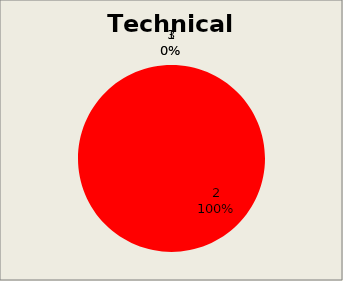
| Category | Series 3 |
|---|---|
| 0 | 0 |
| 1 | 60 |
| 2 | 0 |